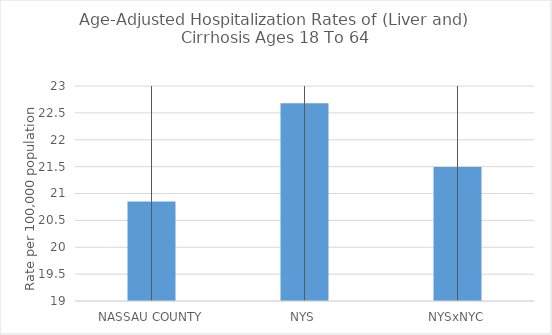
| Category | Age-Adjusted Hospitalization Rates of (Liver and) Cirrhosis Ages 18 To 64 |
|---|---|
| NASSAU COUNTY | 20.85 |
| NYS | 22.678 |
| NYSxNYC | 21.494 |